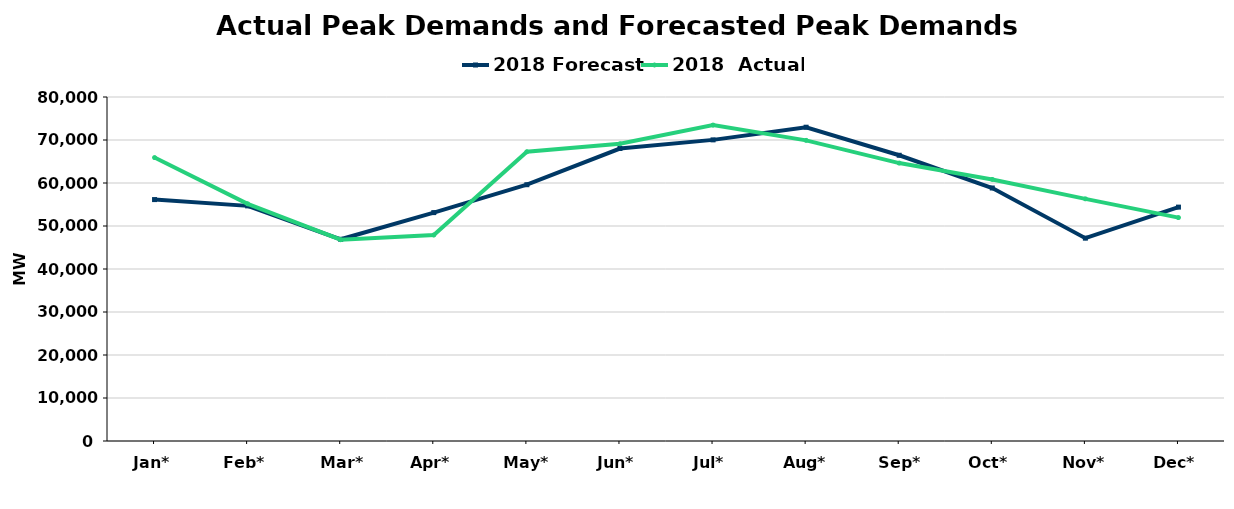
| Category | 2018 Forecast | 2018  Actual |
|---|---|---|
| Jan* | 56143 | 65915 |
| Feb* | 54681 | 55163 |
| Mar* | 46909 | 46812 |
| Apr* | 53115 | 47899 |
| May* | 59601 | 67265 |
| Jun* | 68019 | 69123 |
| Jul* | 70030 | 73473 |
| Aug* | 72974 | 69919 |
| Sep* | 66448 | 64630 |
| Oct* | 58837 | 60827 |
| Nov* | 47173 | 56317 |
| Dec* | 54389 | 51956 |